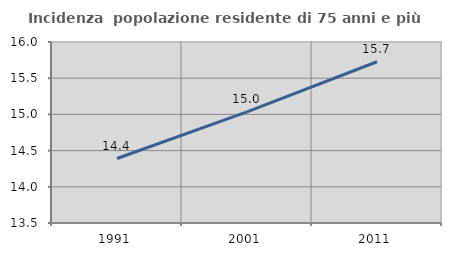
| Category | Incidenza  popolazione residente di 75 anni e più |
|---|---|
| 1991.0 | 14.39 |
| 2001.0 | 15.035 |
| 2011.0 | 15.727 |